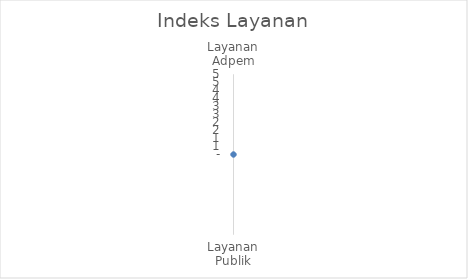
| Category | Indeks |
|---|---|
| Layanan Adpem | 0 |
| Layanan Publik | 0 |